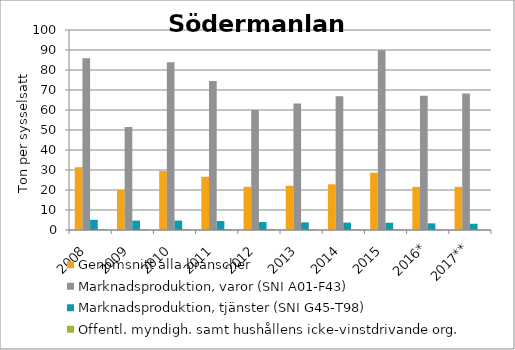
| Category | Genomsnitt alla branscher | Marknadsproduktion, varor (SNI A01-F43) | Marknadsproduktion, tjänster (SNI G45-T98) | Offentl. myndigh. samt hushållens icke-vinstdrivande org. |
|---|---|---|---|---|
| 2008 | 31.397 | 85.848 | 5.097 | 0.502 |
| 2009 | 19.978 | 51.443 | 4.706 | 0.503 |
| 2010 | 29.434 | 83.888 | 4.706 | 0.524 |
| 2011 | 26.635 | 74.556 | 4.472 | 0.505 |
| 2012 | 21.599 | 60.006 | 3.967 | 0.524 |
| 2013 | 22.123 | 63.258 | 3.827 | 0.454 |
| 2014 | 22.851 | 66.84 | 3.695 | 0.421 |
| 2015 | 28.669 | 89.91 | 3.629 | 0.411 |
| 2016* | 21.539 | 67.158 | 3.316 | 0.392 |
| 2017** | 21.56 | 68.205 | 3.124 | 0.359 |